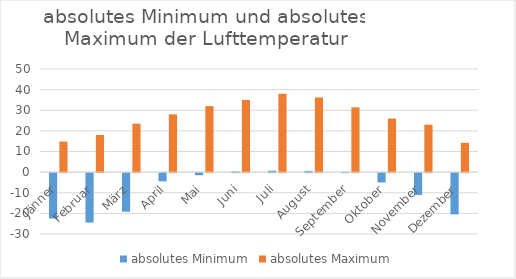
| Category | absolutes Minimum | absolutes Maximum |
|---|---|---|
| Jänner | -22 | 14.8 |
| Februar | -24 | 18 |
| März | -18.7 | 23.5 |
| April | -4 | 28 |
| Mai | -1 | 32 |
| Juni | 0.3 | 35 |
| Juli | 0.7 | 38 |
| August | 0.6 | 36.2 |
| September | 0.1 | 31.4 |
| Oktober | -4.5 | 26 |
| November | -10.6 | 23 |
| Dezember | -20 | 14.2 |